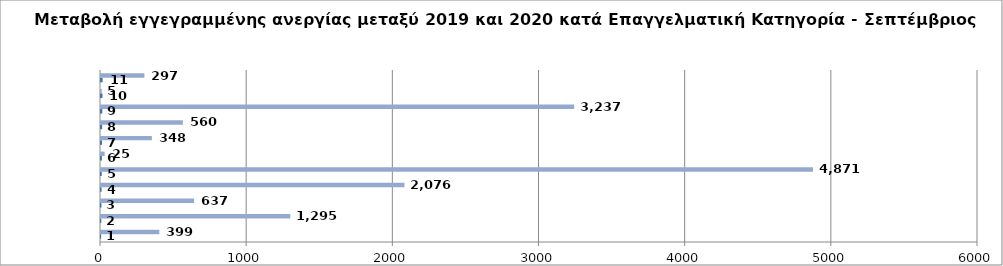
| Category | Series 0 | Series 1 |
|---|---|---|
| 0 | 1 | 399 |
| 1 | 2 | 1295 |
| 2 | 3 | 637 |
| 3 | 4 | 2076 |
| 4 | 5 | 4871 |
| 5 | 6 | 25 |
| 6 | 7 | 348 |
| 7 | 8 | 560 |
| 8 | 9 | 3237 |
| 9 | 10 | 5 |
| 10 | 11 | 297 |